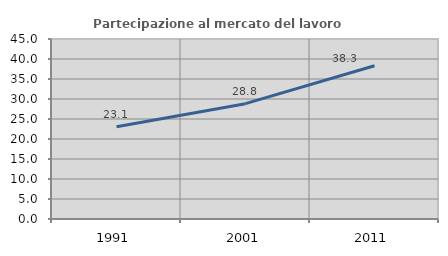
| Category | Partecipazione al mercato del lavoro  femminile |
|---|---|
| 1991.0 | 23.077 |
| 2001.0 | 28.837 |
| 2011.0 | 38.307 |